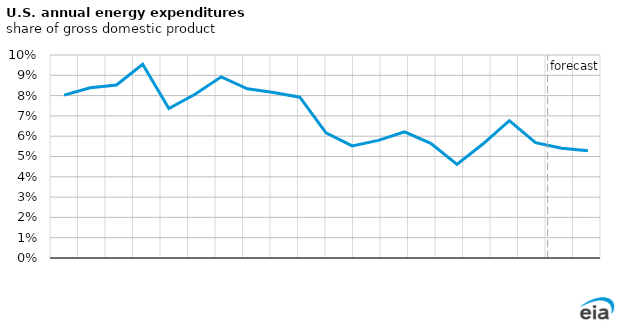
| Category | Energy expenditures as a share of GDP |
|---|---|
| 2005.0 | 0.08 |
| 2006.0 | 0.084 |
| 2007.0 | 0.085 |
| 2008.0 | 0.095 |
| 2009.0 | 0.074 |
| 2010.0 | 0.081 |
| 2011.0 | 0.089 |
| 2012.0 | 0.083 |
| 2013.0 | 0.082 |
| 2014.0 | 0.079 |
| 2015.0 | 0.062 |
| 2016.0 | 0.055 |
| 2017.0 | 0.058 |
| 2018.0 | 0.062 |
| 2019.0 | 0.057 |
| 2020.0 | 0.046 |
| 2021.0 | 0.056 |
| 2022.0 | 0.068 |
| 2023.0 | 0.057 |
| 2024.0 | 0.054 |
| 2025.0 | 0.053 |